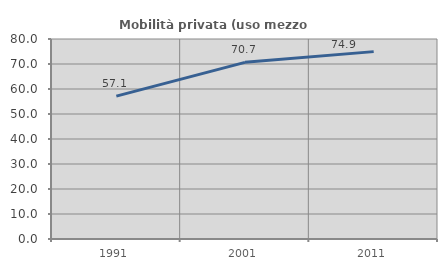
| Category | Mobilità privata (uso mezzo privato) |
|---|---|
| 1991.0 | 57.132 |
| 2001.0 | 70.663 |
| 2011.0 | 74.948 |